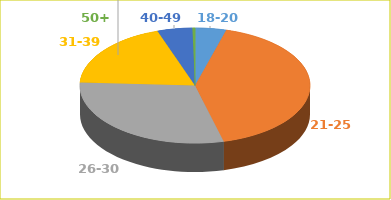
| Category | Series 0 |
|---|---|
| 18-20 | 24 |
| 21-25 | 229 |
| 26-30 | 164 |
| 31-39 | 104 |
| 40-49  | 27 |
| 50+  | 2 |